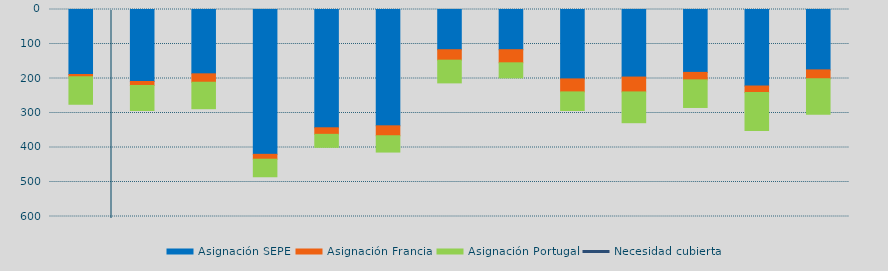
| Category | Asignación SEPE | Asignación Francia | Asignación Portugal |
|---|---|---|---|
| 0 | 188386.325 | 6515.6 | 79746.7 |
| 1 | 208745.675 | 11423.2 | 72605.3 |
| 2 | 186451.1 | 24373.9 | 76706.4 |
| 3 | 419821.425 | 14091.1 | 50867.1 |
| 4 | 342830.4 | 19044.4 | 37683.7 |
| 5 | 337163.825 | 28792 | 47265.2 |
| 6 | 116549.7 | 30280 | 65872.4 |
| 7 | 116506.5 | 38015.1 | 43669.5 |
| 8 | 201179.9 | 37645.7 | 53874.9 |
| 9 | 195827.025 | 43063.3 | 89231.9 |
| 10 | 182309.325 | 21642.7 | 80020.9 |
| 11 | 221780.575 | 19149.1 | 109984.5 |
| 12 | 175030.425 | 25840.2 | 102588 |